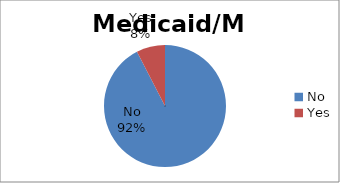
| Category | Series 0 |
|---|---|
| No | 92.404 |
| Yes | 7.596 |